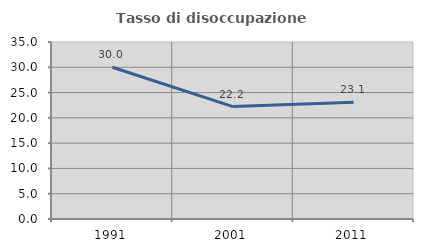
| Category | Tasso di disoccupazione giovanile  |
|---|---|
| 1991.0 | 30 |
| 2001.0 | 22.222 |
| 2011.0 | 23.077 |